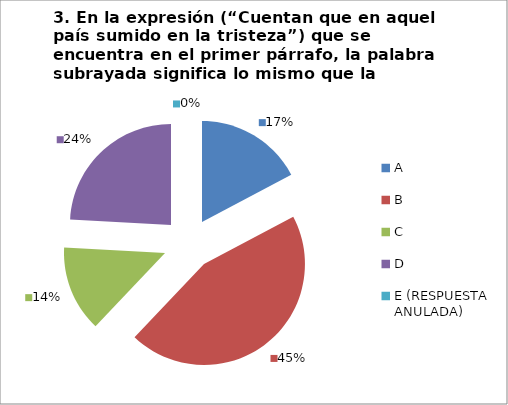
| Category | CANTIDAD DE RESPUESTAS PREGUNTA (3) | PORCENTAJE |
|---|---|---|
| A | 5 | 0.172 |
| B | 13 | 0.448 |
| C | 4 | 0.138 |
| D | 7 | 0.241 |
| E (RESPUESTA ANULADA) | 0 | 0 |